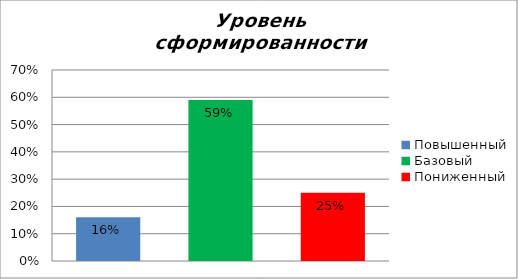
| Category | Уровень сформированности предметных результатов |
|---|---|
| Повышенный | 0.16 |
| Базовый | 0.59 |
| Пониженный | 0.25 |